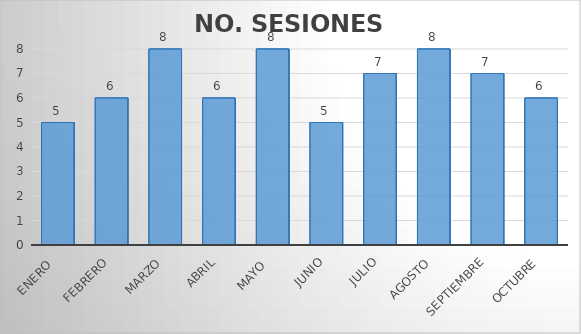
| Category | NO. SESIONES EFECTUADAS |
|---|---|
| Enero  | 5 |
| Febrero | 6 |
| Marzo | 8 |
| Abril | 6 |
| Mayo  | 8 |
| Junio | 5 |
| Julio | 7 |
| Agosto | 8 |
| Septiembre | 7 |
| Octubre | 6 |